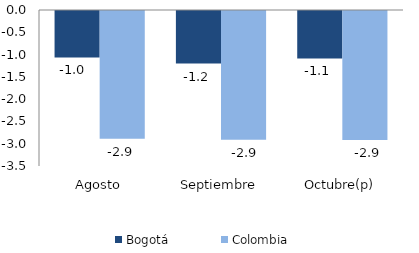
| Category | Bogotá | Colombia |
|---|---|---|
| Agosto | -1.043 | -2.865 |
| Septiembre | -1.18 | -2.887 |
| Octubre(p) | -1.066 | -2.897 |